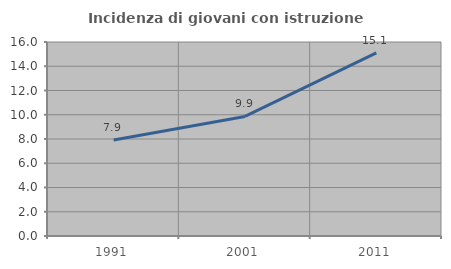
| Category | Incidenza di giovani con istruzione universitaria |
|---|---|
| 1991.0 | 7.922 |
| 2001.0 | 9.861 |
| 2011.0 | 15.109 |